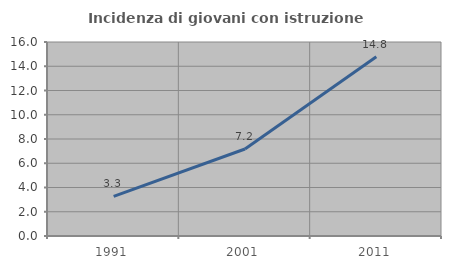
| Category | Incidenza di giovani con istruzione universitaria |
|---|---|
| 1991.0 | 3.264 |
| 2001.0 | 7.177 |
| 2011.0 | 14.777 |